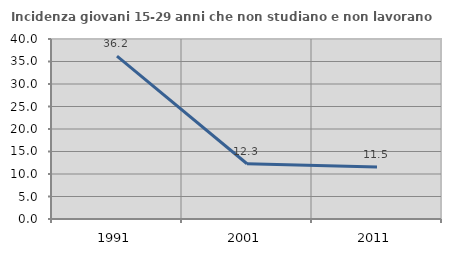
| Category | Incidenza giovani 15-29 anni che non studiano e non lavorano  |
|---|---|
| 1991.0 | 36.184 |
| 2001.0 | 12.281 |
| 2011.0 | 11.538 |